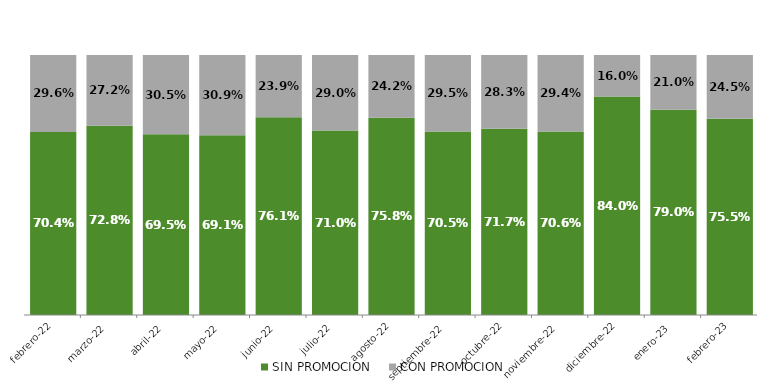
| Category | SIN PROMOCION   | CON PROMOCION   |
|---|---|---|
| 2022-02-01 | 0.704 | 0.296 |
| 2022-03-01 | 0.728 | 0.272 |
| 2022-04-01 | 0.695 | 0.305 |
| 2022-05-01 | 0.691 | 0.309 |
| 2022-06-01 | 0.761 | 0.239 |
| 2022-07-01 | 0.71 | 0.29 |
| 2022-08-01 | 0.758 | 0.242 |
| 2022-09-01 | 0.705 | 0.295 |
| 2022-10-01 | 0.717 | 0.283 |
| 2022-11-01 | 0.706 | 0.294 |
| 2022-12-01 | 0.84 | 0.16 |
| 2023-01-01 | 0.79 | 0.21 |
| 2023-02-01 | 0.755 | 0.245 |